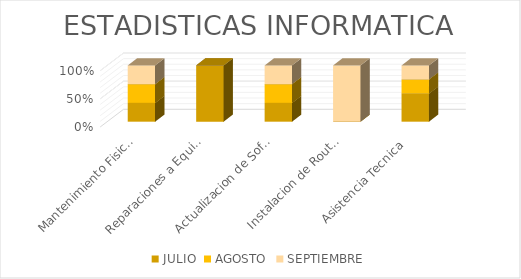
| Category | JULIO | AGOSTO | SEPTIEMBRE |
|---|---|---|---|
| Mantenimiento Fisico y Logico | 5 | 5 | 5 |
| Reparaciones a Equipos  | 1 | 0 | 0 |
| Actualizacion de Software | 5 | 5 | 5 |
| Instalacion de Router Inalambrico | 0 | 0 | 1 |
| Asistencia Tecnica | 10 | 5 | 5 |